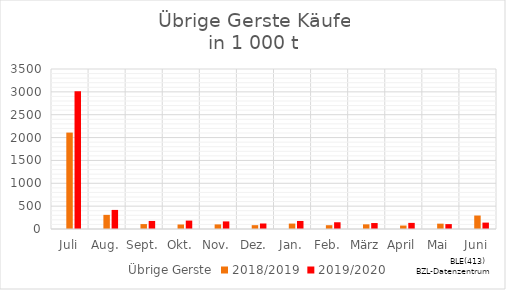
| Category | Übrige Gerste | 2018/2019 | 2019/2020 |
|---|---|---|---|
| Juli |  | 2109.009 | 3010.654 |
| Aug. |  | 309.183 | 417.355 |
| Sept. |  | 107.504 | 175.877 |
| Okt. |  | 98.654 | 183.78 |
| Nov. |  | 100.638 | 166.042 |
| Dez. |  | 83.795 | 120.475 |
| Jan. |  | 118.559 | 175.85 |
| Feb. |  | 83.172 | 147.425 |
| März |  | 102.045 | 130.421 |
| April |  | 75.643 | 133.762 |
| Mai |  | 116.692 | 106.986 |
| Juni |  | 294.608 | 139.938 |